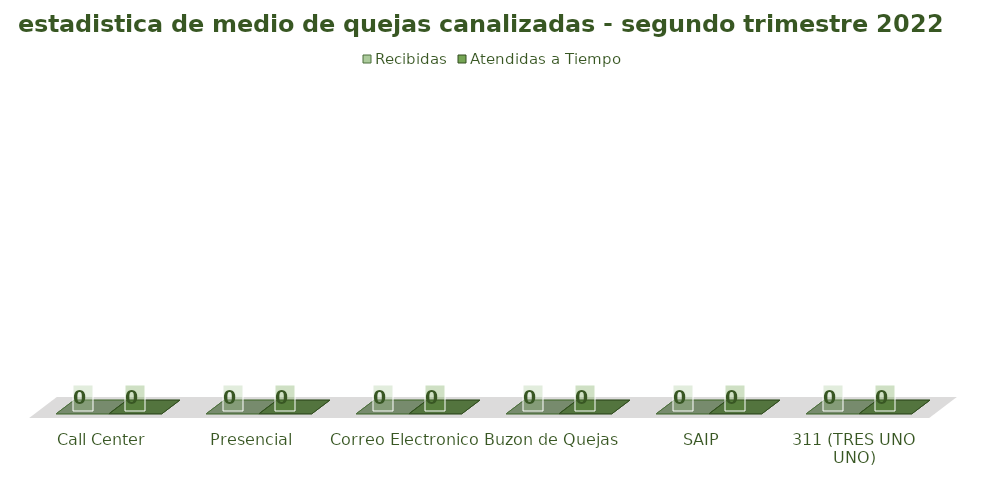
| Category | Recibidas | Atendidas a Tiempo |
|---|---|---|
| Call Center | 0 | 0 |
| Presencial | 0 | 0 |
| Correo Electronico  | 0 | 0 |
| Buzon de Quejas | 0 | 0 |
| SAIP | 0 | 0 |
| 311 (TRES UNO UNO) | 0 | 0 |